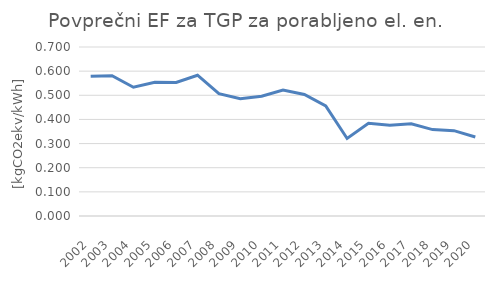
| Category | Series 0 |
|---|---|
| 2002.0 | 0.579 |
| 2003.0 | 0.581 |
| 2004.0 | 0.533 |
| 2005.0 | 0.554 |
| 2006.0 | 0.553 |
| 2007.0 | 0.583 |
| 2008.0 | 0.506 |
| 2009.0 | 0.486 |
| 2010.0 | 0.496 |
| 2011.0 | 0.522 |
| 2012.0 | 0.503 |
| 2013.0 | 0.456 |
| 2014.0 | 0.321 |
| 2015.0 | 0.384 |
| 2016.0 | 0.376 |
| 2017.0 | 0.382 |
| 2018.0 | 0.358 |
| 2019.0 | 0.353 |
| 2020.0 | 0.327 |